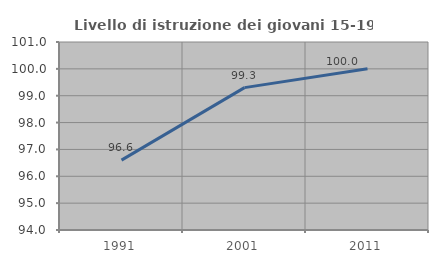
| Category | Livello di istruzione dei giovani 15-19 anni |
|---|---|
| 1991.0 | 96.602 |
| 2001.0 | 99.301 |
| 2011.0 | 100 |